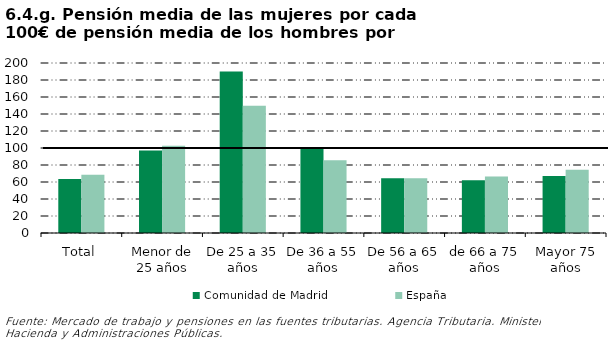
| Category | Comunidad de Madrid | España |
|---|---|---|
| Total | 63.647 | 68.656 |
| Menor de 25 años | 96.995 | 102.539 |
| De 25 a 35 años | 190.012 | 149.646 |
| De 36 a 55 años | 100.053 | 85.587 |
| De 56 a 65 años | 64.397 | 64.489 |
| de 66 a 75 años | 61.98 | 66.522 |
| Mayor 75 años | 66.938 | 74.473 |